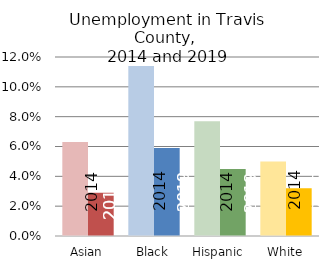
| Category | 2010-2014 | 2015-2019 |
|---|---|---|
| Asian | 0.063 | 0.029 |
| Black | 0.114 | 0.059 |
| Hispanic | 0.077 | 0.045 |
| White | 0.05 | 0.032 |